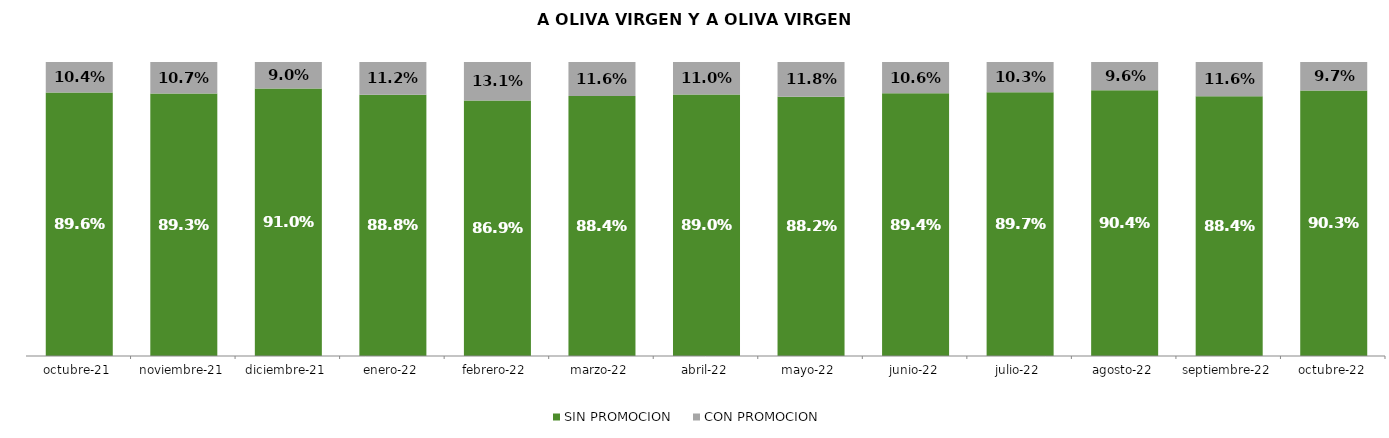
| Category | SIN PROMOCION   | CON PROMOCION   |
|---|---|---|
| 2021-10-01 | 0.896 | 0.104 |
| 2021-11-01 | 0.893 | 0.107 |
| 2021-12-01 | 0.91 | 0.09 |
| 2022-01-01 | 0.888 | 0.112 |
| 2022-02-01 | 0.869 | 0.131 |
| 2022-03-01 | 0.884 | 0.116 |
| 2022-04-01 | 0.89 | 0.11 |
| 2022-05-01 | 0.882 | 0.118 |
| 2022-06-01 | 0.894 | 0.106 |
| 2022-07-01 | 0.897 | 0.103 |
| 2022-08-01 | 0.904 | 0.096 |
| 2022-09-01 | 0.884 | 0.116 |
| 2022-10-01 | 0.903 | 0.097 |